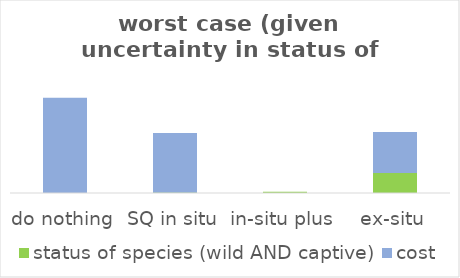
| Category | status of species (wild AND captive) | cost |
|---|---|---|
| do nothing | 0 | 0.394 |
| SQ in situ | 0.005 | 0.243 |
| in-situ plus | 0.005 | 0 |
| ex-situ | 0.087 | 0.165 |